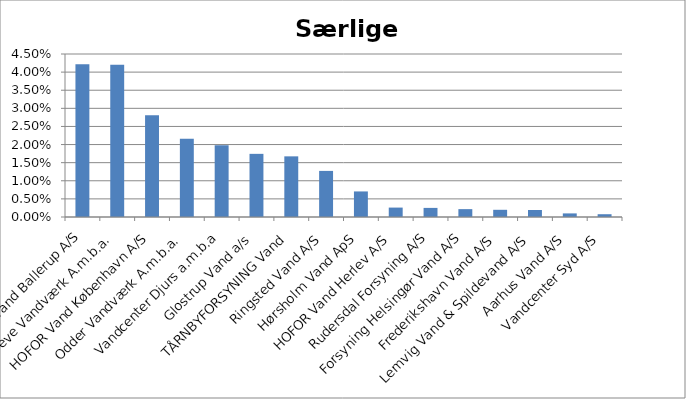
| Category | Series 0 |
|---|---|
| Vand Ballerup A/S | 0.042 |
| Greve Vandværk A.m.b.a. | 0.042 |
| HOFOR Vand København A/S | 0.028 |
| Odder Vandværk A.m.b.a. | 0.022 |
| Vandcenter Djurs a.m.b.a | 0.02 |
| Glostrup Vand a/s | 0.017 |
| TÅRNBYFORSYNING Vand | 0.017 |
| Ringsted Vand A/S | 0.013 |
| Hørsholm Vand ApS | 0.007 |
| HOFOR Vand Herlev A/S | 0.003 |
| Rudersdal Forsyning A/S | 0.003 |
| Forsyning Helsingør Vand A/S | 0.002 |
| Frederikshavn Vand A/S | 0.002 |
| Lemvig Vand & Spildevand A/S | 0.002 |
| Aarhus Vand A/S | 0.001 |
| Vandcenter Syd A/S | 0.001 |